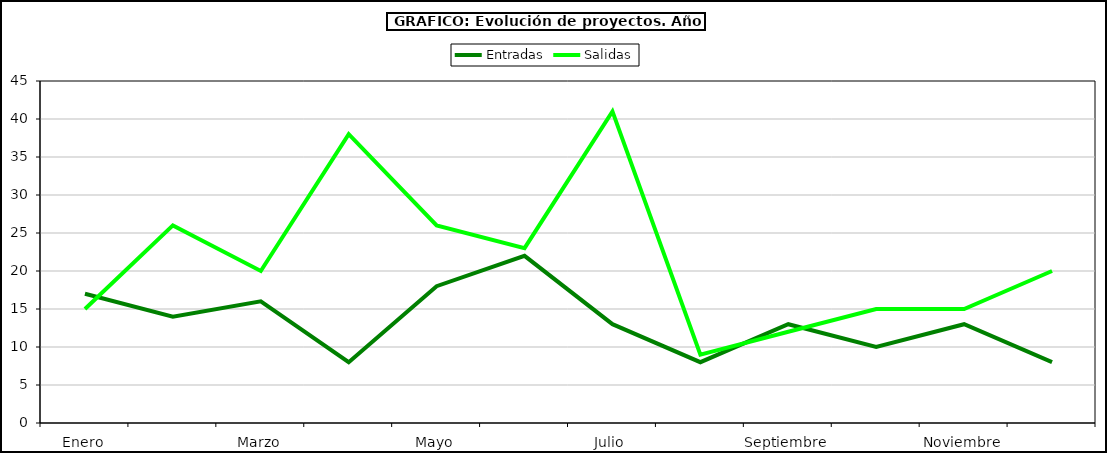
| Category | Entradas | Salidas |
|---|---|---|
| Enero | 17 | 15 |
| Febrero | 14 | 26 |
| Marzo | 16 | 20 |
| Abril | 8 | 38 |
| Mayo | 18 | 26 |
| Junio | 22 | 23 |
| Julio | 13 | 41 |
| Agosto | 8 | 9 |
| Septiembre | 13 | 12 |
| Octubre | 10 | 15 |
| Noviembre | 13 | 15 |
| Diciembre | 8 | 20 |